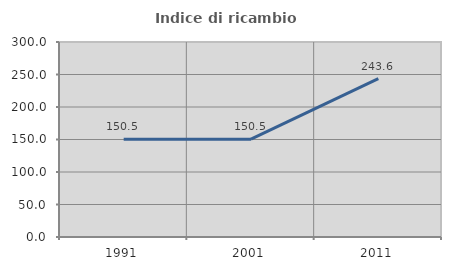
| Category | Indice di ricambio occupazionale  |
|---|---|
| 1991.0 | 150.482 |
| 2001.0 | 150.469 |
| 2011.0 | 243.609 |